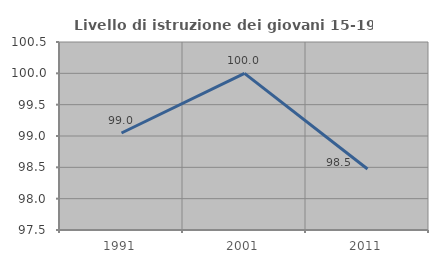
| Category | Livello di istruzione dei giovani 15-19 anni |
|---|---|
| 1991.0 | 99.048 |
| 2001.0 | 100 |
| 2011.0 | 98.473 |